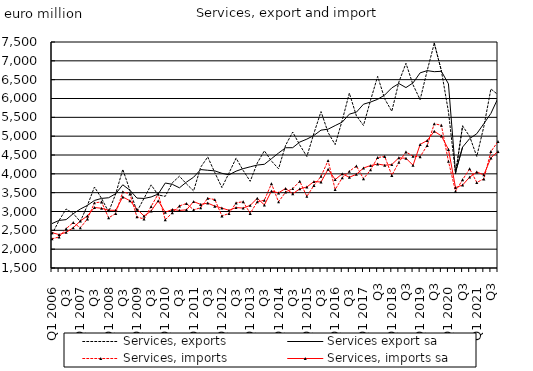
| Category | Services, exports | Services export sa | Services, imports | Services, imports sa |
|---|---|---|---|---|
| Q1 2006 | 2397.51 | 2680.116 | 2276.027 | 2437.646 |
| Q2  | 2762.457 | 2763.135 | 2322.594 | 2387.501 |
| Q3  | 3066.682 | 2784.671 | 2544.215 | 2447.721 |
| Q4  | 2945.411 | 2942.273 | 2707.285 | 2567.969 |
| Q1 2007 | 2732.481 | 3064.704 | 2565.444 | 2748.574 |
| Q2  | 3161.304 | 3162.4 | 2804.118 | 2883.254 |
| Q3  | 3650.393 | 3293.61 | 3229.897 | 3106.67 |
| Q4  | 3347.606 | 3347.294 | 3254.037 | 3085.293 |
| Q1 2008 | 2989.168 | 3365.286 | 2831.209 | 3034.394 |
| Q2  | 3468.025 | 3472.484 | 2947.254 | 3031.174 |
| Q3  | 4118.584 | 3709.056 | 3522.07 | 3387.316 |
| Q4  | 3563.554 | 3565.793 | 3467.226 | 3286.099 |
| Q1 2009 | 3000.318 | 3355.74 | 2857.579 | 3063.441 |
| Q2  | 3349.823 | 3347.127 | 2799.794 | 2879.768 |
| Q3  | 3706.609 | 3385.455 | 3133.33 | 3013.645 |
| Q4  | 3438.873 | 3463.693 | 3465.527 | 3283.645 |
| Q1 2010 | 3402.628 | 3755.835 | 2779.077 | 2979.83 |
| Q2  | 3762.6 | 3721.258 | 2969.649 | 3054.147 |
| Q3  | 3936.644 | 3628.595 | 3149.012 | 3028.913 |
| Q4  | 3731.361 | 3781.26 | 3212.877 | 3044.12 |
| Q1 2011 | 3545.678 | 3909.55 | 3043.327 | 3263.623 |
| Q2  | 4175.548 | 4113.276 | 3100.12 | 3187.877 |
| Q3  | 4448.219 | 4095.095 | 3350.76 | 3223.018 |
| Q4  | 4031.401 | 4078.593 | 3316.807 | 3142.371 |
| Q1 2012 | 3635.197 | 4014.021 | 2882.76 | 3092.073 |
| Q2  | 4021.056 | 3972.49 | 2947.745 | 3030.732 |
| Q3  | 4415.751 | 4071.004 | 3227.828 | 3104.912 |
| Q4  | 4091.327 | 4136.653 | 3261.444 | 3089.632 |
| Q1 2013 | 3801.488 | 4186.69 | 2948.983 | 3163.769 |
| Q2  | 4288.282 | 4233.502 | 3260.337 | 3351.54 |
| Q3  | 4610.519 | 4253.424 | 3299.533 | 3174.042 |
| Q4  | 4340.586 | 4401.807 | 3739.904 | 3542.563 |
| Q1 2014 | 4134.793 | 4551.814 | 3256.298 | 3494.175 |
| Q2  | 4757.655 | 4692.439 | 3514.538 | 3612.511 |
| Q3  | 5109.669 | 4694.507 | 3608.398 | 3470.819 |
| Q4  | 4765.773 | 4843.478 | 3801.535 | 3600.908 |
| Q1 2015 | 4459.301 | 4921.261 | 3401.583 | 3650.806 |
| Q2  | 5077.503 | 5019.116 | 3692.025 | 3794.891 |
| Q3  | 5652.697 | 5159.984 | 3933.424 | 3782.672 |
| Q4 | 5096.045 | 5185.338 | 4351.179 | 4121.656 |
| Q1 2016 | 4775.634 | 5281.465 | 3583.83 | 3847.044 |
| Q2  | 5422.221 | 5373.924 | 3893.373 | 4001.936 |
| Q3  | 6141.981 | 5584.579 | 4066.209 | 3909.28 |
| Q4 | 5538.196 | 5637.767 | 4209.089 | 3987.682 |
| Q1 2017 | 5284.805 | 5848.56 | 3869.507 | 4154.127 |
| Q2  | 5954.37 | 5905.945 | 4105.431 | 4220.145 |
| Q3 | 6588.446 | 5978.393 | 4432.644 | 4260.132 |
| Q4 | 5989.021 | 6092.827 | 4462.494 | 4228.373 |
| Q1 2018 | 5660.195 | 6282.468 | 3958.77 | 4247.248 |
| Q2  | 6437.837 | 6397.728 | 4307.708 | 4426.774 |
| Q3 | 6935.105 | 6289.788 | 4582.7 | 4413.13 |
| Q4 | 6362.421 | 6414.041 | 4466.448 | 4227.412 |
| Q1 2019 | 5968.78 | 6681.038 | 4454.932 | 4779.906 |
| Q2  | 6742.086 | 6740.059 | 4753.505 | 4885.475 |
| Q3 | 7466.915 | 6712.02 | 5328.634 | 5130.794 |
| Q4 | 6739.597 | 6721.879 | 5290.451 | 5006.703 |
| Q1 2020 | 5647.833 | 6389.789 | 4332.094 | 4648.486 |
| Q2  | 4005.094 | 4039.764 | 3536.127 | 3634.837 |
| Q3 | 5271.818 | 4710.529 | 3845.78 | 3702.81 |
| Q4 | 4991.63 | 4936.162 | 4134.893 | 3912.687 |
| Q1 2021 | 4461.249 | 5064.398 | 3772.203 | 4047.69 |
| Q2  | 5253.891 | 5331.511 | 3865.475 | 3973.857 |
| Q3 | 6254.505 | 5604.504 | 4593.598 | 4422.692 |
| Q4 | 6099.356 | 6009.043 | 4856.612 | 4595.371 |